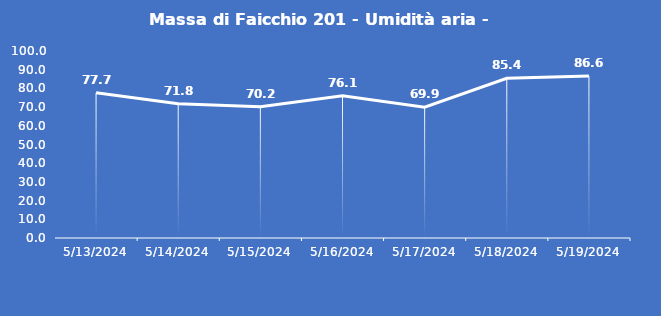
| Category | Massa di Faicchio 201 - Umidità aria - Grezzo (%) |
|---|---|
| 5/13/24 | 77.7 |
| 5/14/24 | 71.8 |
| 5/15/24 | 70.2 |
| 5/16/24 | 76.1 |
| 5/17/24 | 69.9 |
| 5/18/24 | 85.4 |
| 5/19/24 | 86.6 |